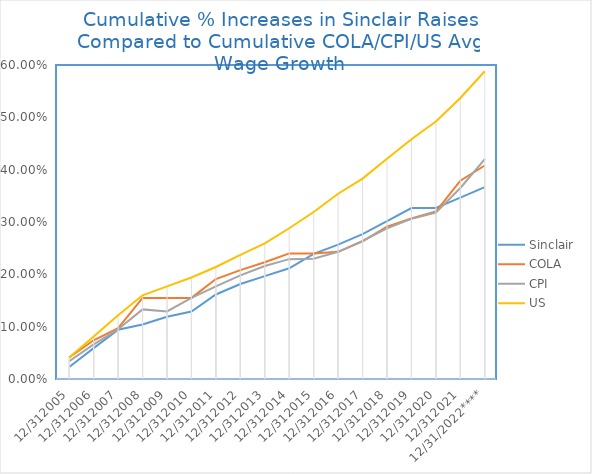
| Category | Sinclair | COLA | CPI | US  |
|---|---|---|---|---|
| 12/312005 | 0.023 | 0.041 | 0.034 | 0.041 |
| 12/312006 | 0.059 | 0.074 | 0.066 | 0.081 |
| 12/312007 | 0.094 | 0.097 | 0.095 | 0.122 |
| 12/312008 | 0.104 | 0.155 | 0.133 | 0.16 |
| 12/312009 | 0.119 | 0.155 | 0.129 | 0.177 |
| 12/312010 | 0.129 | 0.155 | 0.155 | 0.194 |
| 12/312011 | 0.162 | 0.191 | 0.177 | 0.214 |
| 12/312012 | 0.182 | 0.208 | 0.198 | 0.237 |
| 12/312013 | 0.196 | 0.223 | 0.216 | 0.259 |
| 12/312014 | 0.212 | 0.24 | 0.229 | 0.288 |
| 12/312015 | 0.239 | 0.24 | 0.23 | 0.319 |
| 12/312016 | 0.257 | 0.243 | 0.243 | 0.354 |
| 12/312017 | 0.277 | 0.263 | 0.264 | 0.383 |
| 12/312018 | 0.302 | 0.291 | 0.288 | 0.421 |
| 12/312019 | 0.327 | 0.307 | 0.306 | 0.458 |
| 12/312020 | 0.327 | 0.32 | 0.318 | 0.492 |
| 12/312021 | 0.347 | 0.379 | 0.365 | 0.537 |
| 12/31/2022**** | 0.367 | 0.408 | 0.42 | 0.588 |